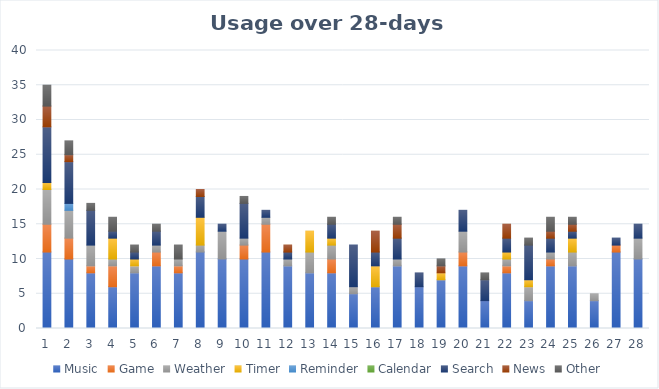
| Category | Music | Game | Weather | Timer | Reminder | Calendar | Search | News | Other |
|---|---|---|---|---|---|---|---|---|---|
| 0 | 11 | 4 | 5 | 1 | 0 | 0 | 8 | 3 | 3 |
| 1 | 10 | 3 | 4 | 0 | 1 | 0 | 6 | 1 | 2 |
| 2 | 8 | 1 | 3 | 0 | 0 | 0 | 5 | 0 | 1 |
| 3 | 6 | 3 | 1 | 3 | 0 | 0 | 1 | 0 | 2 |
| 4 | 8 | 0 | 1 | 1 | 0 | 0 | 1 | 0 | 1 |
| 5 | 9 | 2 | 1 | 0 | 0 | 0 | 2 | 0 | 1 |
| 6 | 8 | 1 | 1 | 0 | 0 | 0 | 0 | 0 | 2 |
| 7 | 11 | 0 | 1 | 4 | 0 | 0 | 3 | 1 | 0 |
| 8 | 10 | 0 | 4 | 0 | 0 | 0 | 1 | 0 | 0 |
| 9 | 10 | 2 | 1 | 0 | 0 | 0 | 5 | 0 | 1 |
| 10 | 11 | 4 | 1 | 0 | 0 | 0 | 1 | 0 | 0 |
| 11 | 9 | 0 | 1 | 0 | 0 | 0 | 1 | 1 | 0 |
| 12 | 8 | 0 | 3 | 3 | 0 | 0 | 0 | 0 | 0 |
| 13 | 8 | 2 | 2 | 1 | 0 | 0 | 2 | 0 | 1 |
| 14 | 5 | 0 | 1 | 0 | 0 | 0 | 6 | 0 | 0 |
| 15 | 6 | 0 | 0 | 3 | 0 | 0 | 2 | 3 | 0 |
| 16 | 9 | 0 | 1 | 0 | 0 | 0 | 3 | 2 | 1 |
| 17 | 6 | 0 | 0 | 0 | 0 | 0 | 2 | 0 | 0 |
| 18 | 7 | 0 | 0 | 1 | 0 | 0 | 0 | 1 | 1 |
| 19 | 9 | 2 | 3 | 0 | 0 | 0 | 3 | 0 | 0 |
| 20 | 4 | 0 | 0 | 0 | 0 | 0 | 3 | 0 | 1 |
| 21 | 8 | 1 | 1 | 1 | 0 | 0 | 2 | 2 | 0 |
| 22 | 4 | 0 | 2 | 1 | 0 | 0 | 5 | 0 | 1 |
| 23 | 9 | 1 | 1 | 0 | 0 | 0 | 2 | 1 | 2 |
| 24 | 9 | 0 | 2 | 2 | 0 | 0 | 1 | 1 | 1 |
| 25 | 4 | 0 | 1 | 0 | 0 | 0 | 0 | 0 | 0 |
| 26 | 11 | 1 | 0 | 0 | 0 | 0 | 1 | 0 | 0 |
| 27 | 10 | 0 | 3 | 0 | 0 | 0 | 2 | 0 | 0 |